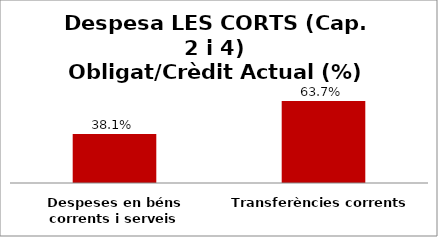
| Category | Series 0 |
|---|---|
| Despeses en béns corrents i serveis | 0.381 |
| Transferències corrents | 0.637 |